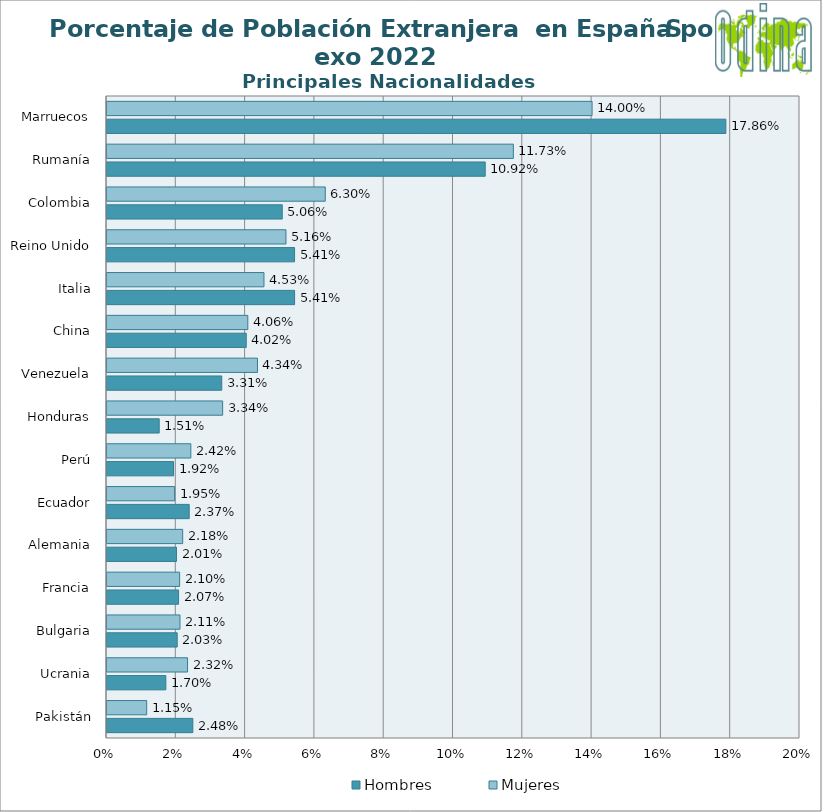
| Category | Hombres | Mujeres |
|---|---|---|
| Pakistán | 0.025 | 0.011 |
| Ucrania | 0.017 | 0.023 |
| Bulgaria | 0.02 | 0.021 |
| Francia | 0.021 | 0.021 |
| Alemania | 0.02 | 0.022 |
| Ecuador | 0.024 | 0.02 |
| Perú | 0.019 | 0.024 |
| Honduras | 0.015 | 0.033 |
| Venezuela | 0.033 | 0.043 |
| China | 0.04 | 0.041 |
| Italia | 0.054 | 0.045 |
| Reino Unido | 0.054 | 0.052 |
| Colombia | 0.051 | 0.063 |
| Rumanía | 0.109 | 0.117 |
| Marruecos | 0.179 | 0.14 |